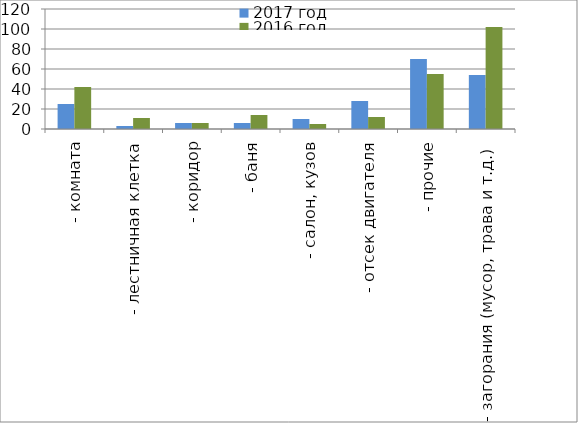
| Category | 2017 год | 2016 год |
|---|---|---|
|  - комната | 25 | 42 |
|  - лестничная клетка | 3 | 11 |
|  - коридор | 6 | 6 |
|  - баня | 6 | 14 |
|  - салон, кузов | 10 | 5 |
|  - отсек двигателя | 28 | 12 |
| - прочие | 70 | 55 |
| - загорания (мусор, трава и т.д.)  | 54 | 102 |